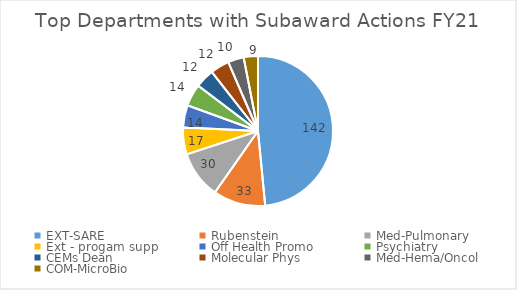
| Category | FY21 |
|---|---|
| EXT-SARE | 142 |
| Rubenstein | 33 |
| Med-Pulmonary | 30 |
| Ext - progam supp | 17 |
| Off Health Promo | 14 |
| Psychiatry | 14 |
| CEMs Dean | 12 |
| Molecular Phys | 12 |
| Med-Hema/Oncol | 10 |
| COM-MicroBio | 9 |